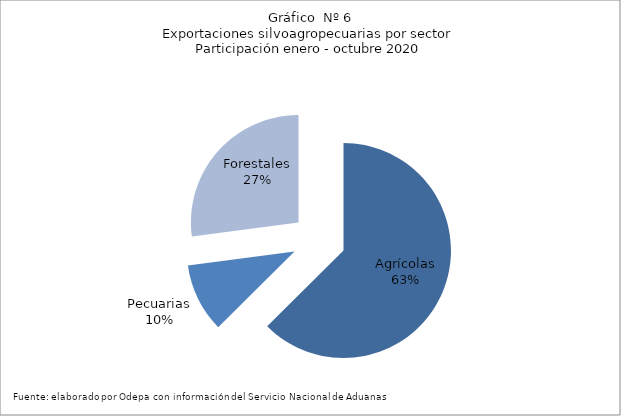
| Category | Series 0 |
|---|---|
| Agrícolas | 8204101 |
| Pecuarias | 1356110 |
| Forestales | 3552961 |